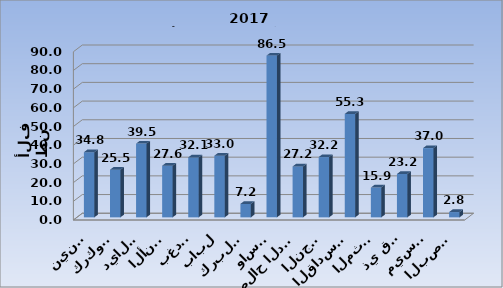
| Category | Series 0 |
|---|---|
| نينوى | 34.835 |
| كركوك | 25.47 |
| ديالى | 39.462 |
| الأنبار | 27.627 |
| بغداد | 32.065 |
| بابل | 32.977 |
| كربلاء | 7.205 |
| واسط | 86.512 |
| صلاح الدين | 27.233 |
| النجف | 32.236 |
| القادسية | 55.331 |
| المثنى | 15.93 |
| ذي قار | 23.2 |
| ميسان | 37.037 |
| البصرة | 2.823 |